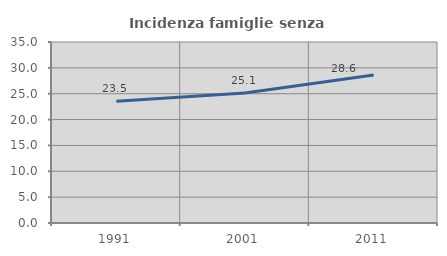
| Category | Incidenza famiglie senza nuclei |
|---|---|
| 1991.0 | 23.524 |
| 2001.0 | 25.131 |
| 2011.0 | 28.614 |